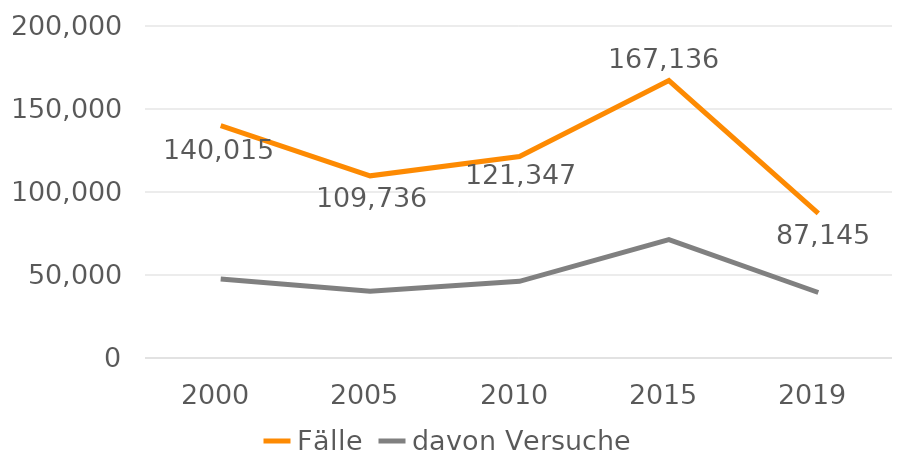
| Category | Fälle | davon Versuche |
|---|---|---|
| 2000.0 | 140015 | 47627 |
| 2005.0 | 109736 | 40200 |
| 2010.0 | 121347 | 46209 |
| 2015.0 | 167136 | 71300 |
| 2019.0 | 87145 | 39466 |